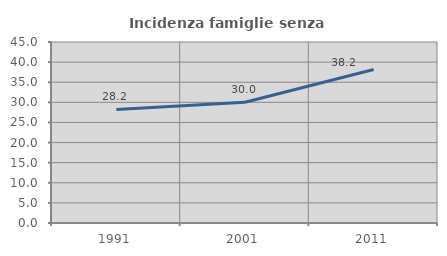
| Category | Incidenza famiglie senza nuclei |
|---|---|
| 1991.0 | 28.248 |
| 2001.0 | 30.016 |
| 2011.0 | 38.158 |